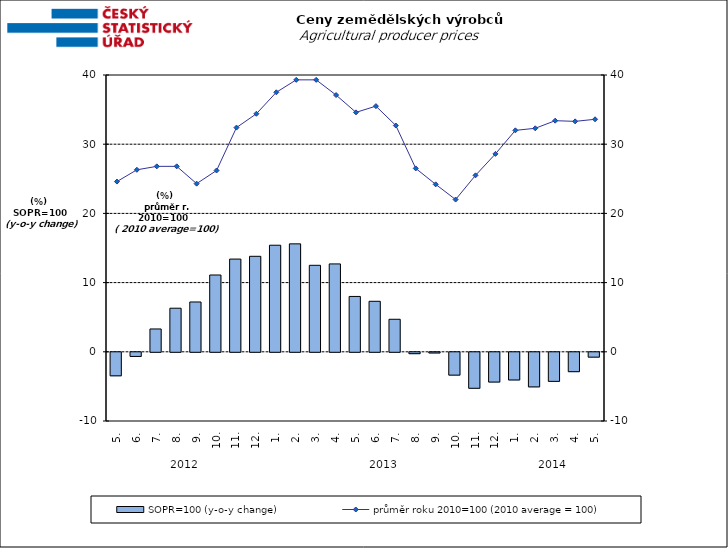
| Category | SOPR=100 (y-o-y change)   |
|---|---|
| 0 | -3.4 |
| 1 | -0.6 |
| 2 | 3.3 |
| 3 | 6.3 |
| 4 | 7.2 |
| 5 | 11.1 |
| 6 | 13.4 |
| 7 | 13.8 |
| 8 | 15.4 |
| 9 | 15.6 |
| 10 | 12.5 |
| 11 | 12.7 |
| 12 | 8 |
| 13 | 7.3 |
| 14 | 4.7 |
| 15 | -0.2 |
| 16 | -0.1 |
| 17 | -3.3 |
| 18 | -5.2 |
| 19 | -4.3 |
| 20 | -4 |
| 21 | -5 |
| 22 | -4.2 |
| 23 | -2.8 |
| 24 | -0.7 |